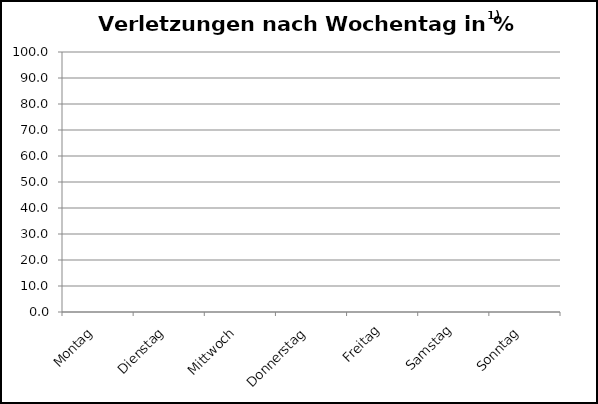
| Category | Series 0 |
|---|---|
| Montag | 0 |
| Dienstag | 0 |
| Mittwoch | 0 |
| Donnerstag | 0 |
| Freitag | 0 |
| Samstag | 0 |
| Sonntag | 0 |